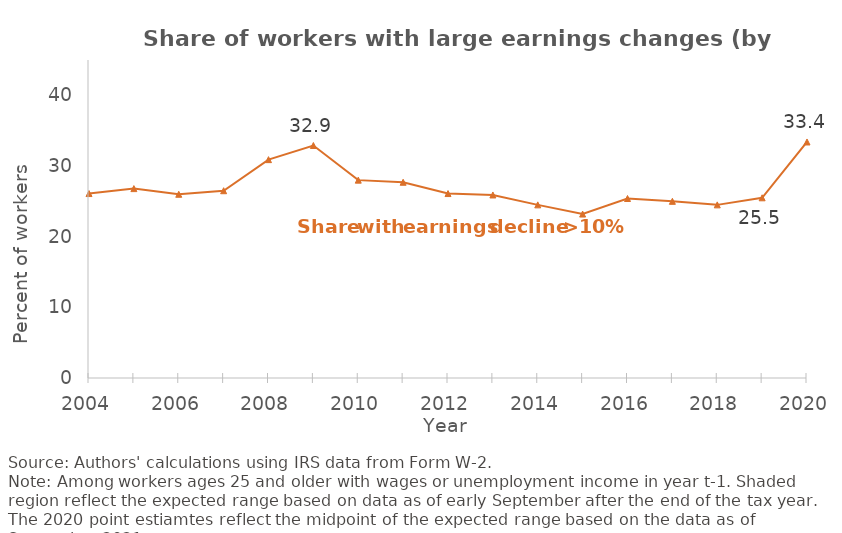
| Category | Share decline 10% or more |
|---|---|
| 0 | 26.1 |
| 1 | 26.8 |
| 2 | 26 |
| 3 | 26.5 |
| 4 | 30.9 |
| 5 | 32.9 |
| 6 | 28 |
| 7 | 27.7 |
| 8 | 26.1 |
| 9 | 25.9 |
| 10 | 24.5 |
| 11 | 23.2 |
| 12 | 25.4 |
| 13 | 25 |
| 14 | 24.5 |
| 15 | 25.5 |
| 16 | 33.4 |